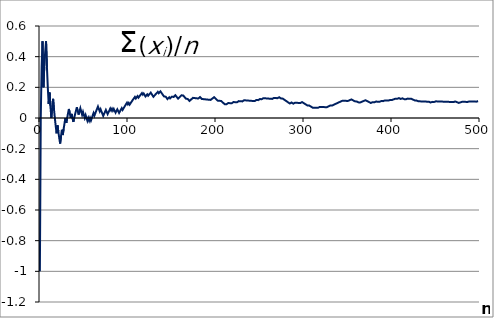
| Category | "Szum(xi)/n" |
|---|---|
| 1.0 | -1 |
| 2.0 | 0 |
| 3.0 | 0.333 |
| 4.0 | 0.5 |
| 5.0 | 0.2 |
| 6.0 | 0.333 |
| 7.0 | 0.429 |
| 8.0 | 0.5 |
| 9.0 | 0.333 |
| 10.0 | 0.2 |
| 11.0 | 0.091 |
| 12.0 | 0.167 |
| 13.0 | 0.077 |
| 14.0 | 0 |
| 15.0 | 0.067 |
| 16.0 | 0.125 |
| 17.0 | 0.059 |
| 18.0 | 0 |
| 19.0 | -0.053 |
| 20.0 | -0.1 |
| 21.0 | -0.048 |
| 22.0 | -0.091 |
| 23.0 | -0.13 |
| 24.0 | -0.167 |
| 25.0 | -0.12 |
| 26.0 | -0.077 |
| 27.0 | -0.111 |
| 28.0 | -0.071 |
| 29.0 | -0.034 |
| 30.0 | 0 |
| 31.0 | -0.032 |
| 32.0 | 0 |
| 33.0 | 0.03 |
| 34.0 | 0.059 |
| 35.0 | 0.029 |
| 36.0 | 0 |
| 37.0 | 0.027 |
| 38.0 | 0 |
| 39.0 | -0.026 |
| 40.0 | 0 |
| 41.0 | 0.024 |
| 42.0 | 0.048 |
| 43.0 | 0.07 |
| 44.0 | 0.045 |
| 45.0 | 0.022 |
| 46.0 | 0.043 |
| 47.0 | 0.064 |
| 48.0 | 0.042 |
| 49.0 | 0.02 |
| 50.0 | 0.04 |
| 51.0 | 0.02 |
| 52.0 | 0 |
| 53.0 | 0.019 |
| 54.0 | 0 |
| 55.0 | -0.018 |
| 56.0 | 0 |
| 57.0 | -0.018 |
| 58.0 | 0 |
| 59.0 | -0.017 |
| 60.0 | 0 |
| 61.0 | 0.016 |
| 62.0 | 0.032 |
| 63.0 | 0.016 |
| 64.0 | 0.031 |
| 65.0 | 0.046 |
| 66.0 | 0.061 |
| 67.0 | 0.075 |
| 68.0 | 0.059 |
| 69.0 | 0.043 |
| 70.0 | 0.057 |
| 71.0 | 0.042 |
| 72.0 | 0.028 |
| 73.0 | 0.014 |
| 74.0 | 0.027 |
| 75.0 | 0.04 |
| 76.0 | 0.053 |
| 77.0 | 0.039 |
| 78.0 | 0.026 |
| 79.0 | 0.038 |
| 80.0 | 0.05 |
| 81.0 | 0.062 |
| 82.0 | 0.049 |
| 83.0 | 0.06 |
| 84.0 | 0.048 |
| 85.0 | 0.059 |
| 86.0 | 0.047 |
| 87.0 | 0.034 |
| 88.0 | 0.045 |
| 89.0 | 0.056 |
| 90.0 | 0.044 |
| 91.0 | 0.033 |
| 92.0 | 0.043 |
| 93.0 | 0.054 |
| 94.0 | 0.064 |
| 95.0 | 0.053 |
| 96.0 | 0.062 |
| 97.0 | 0.072 |
| 98.0 | 0.082 |
| 99.0 | 0.091 |
| 100.0 | 0.1 |
| 101.0 | 0.089 |
| 102.0 | 0.098 |
| 103.0 | 0.087 |
| 104.0 | 0.096 |
| 105.0 | 0.105 |
| 106.0 | 0.113 |
| 107.0 | 0.121 |
| 108.0 | 0.13 |
| 109.0 | 0.138 |
| 110.0 | 0.127 |
| 111.0 | 0.135 |
| 112.0 | 0.143 |
| 113.0 | 0.133 |
| 114.0 | 0.14 |
| 115.0 | 0.148 |
| 116.0 | 0.155 |
| 117.0 | 0.162 |
| 118.0 | 0.153 |
| 119.0 | 0.16 |
| 120.0 | 0.15 |
| 121.0 | 0.14 |
| 122.0 | 0.148 |
| 123.0 | 0.154 |
| 124.0 | 0.145 |
| 125.0 | 0.152 |
| 126.0 | 0.159 |
| 127.0 | 0.165 |
| 128.0 | 0.156 |
| 129.0 | 0.147 |
| 130.0 | 0.138 |
| 131.0 | 0.145 |
| 132.0 | 0.152 |
| 133.0 | 0.158 |
| 134.0 | 0.164 |
| 135.0 | 0.17 |
| 136.0 | 0.162 |
| 137.0 | 0.168 |
| 138.0 | 0.174 |
| 139.0 | 0.165 |
| 140.0 | 0.157 |
| 141.0 | 0.149 |
| 142.0 | 0.141 |
| 143.0 | 0.147 |
| 144.0 | 0.139 |
| 145.0 | 0.131 |
| 146.0 | 0.123 |
| 147.0 | 0.129 |
| 148.0 | 0.135 |
| 149.0 | 0.128 |
| 150.0 | 0.133 |
| 151.0 | 0.139 |
| 152.0 | 0.145 |
| 153.0 | 0.137 |
| 154.0 | 0.143 |
| 155.0 | 0.148 |
| 156.0 | 0.141 |
| 157.0 | 0.134 |
| 158.0 | 0.127 |
| 159.0 | 0.132 |
| 160.0 | 0.138 |
| 161.0 | 0.143 |
| 162.0 | 0.148 |
| 163.0 | 0.153 |
| 164.0 | 0.146 |
| 165.0 | 0.139 |
| 166.0 | 0.133 |
| 167.0 | 0.126 |
| 168.0 | 0.131 |
| 169.0 | 0.124 |
| 170.0 | 0.118 |
| 171.0 | 0.111 |
| 172.0 | 0.116 |
| 173.0 | 0.121 |
| 174.0 | 0.126 |
| 175.0 | 0.131 |
| 176.0 | 0.136 |
| 177.0 | 0.13 |
| 178.0 | 0.124 |
| 179.0 | 0.128 |
| 180.0 | 0.122 |
| 181.0 | 0.127 |
| 182.0 | 0.132 |
| 183.0 | 0.137 |
| 184.0 | 0.13 |
| 185.0 | 0.124 |
| 186.0 | 0.129 |
| 187.0 | 0.123 |
| 188.0 | 0.128 |
| 189.0 | 0.122 |
| 190.0 | 0.116 |
| 191.0 | 0.12 |
| 192.0 | 0.125 |
| 193.0 | 0.119 |
| 194.0 | 0.124 |
| 195.0 | 0.118 |
| 196.0 | 0.122 |
| 197.0 | 0.127 |
| 198.0 | 0.131 |
| 199.0 | 0.136 |
| 200.0 | 0.13 |
| 201.0 | 0.124 |
| 202.0 | 0.119 |
| 203.0 | 0.113 |
| 204.0 | 0.108 |
| 205.0 | 0.112 |
| 206.0 | 0.107 |
| 207.0 | 0.111 |
| 208.0 | 0.106 |
| 209.0 | 0.1 |
| 210.0 | 0.095 |
| 211.0 | 0.09 |
| 212.0 | 0.085 |
| 213.0 | 0.089 |
| 214.0 | 0.093 |
| 215.0 | 0.098 |
| 216.0 | 0.093 |
| 217.0 | 0.097 |
| 218.0 | 0.101 |
| 219.0 | 0.096 |
| 220.0 | 0.1 |
| 221.0 | 0.104 |
| 222.0 | 0.099 |
| 223.0 | 0.103 |
| 224.0 | 0.107 |
| 225.0 | 0.102 |
| 226.0 | 0.106 |
| 227.0 | 0.11 |
| 228.0 | 0.114 |
| 229.0 | 0.109 |
| 230.0 | 0.104 |
| 231.0 | 0.108 |
| 232.0 | 0.112 |
| 233.0 | 0.116 |
| 234.0 | 0.111 |
| 235.0 | 0.115 |
| 236.0 | 0.119 |
| 237.0 | 0.114 |
| 238.0 | 0.109 |
| 239.0 | 0.113 |
| 240.0 | 0.108 |
| 241.0 | 0.112 |
| 242.0 | 0.107 |
| 243.0 | 0.111 |
| 244.0 | 0.107 |
| 245.0 | 0.11 |
| 246.0 | 0.114 |
| 247.0 | 0.117 |
| 248.0 | 0.121 |
| 249.0 | 0.116 |
| 250.0 | 0.12 |
| 251.0 | 0.124 |
| 252.0 | 0.127 |
| 253.0 | 0.123 |
| 254.0 | 0.126 |
| 255.0 | 0.129 |
| 256.0 | 0.133 |
| 257.0 | 0.128 |
| 258.0 | 0.124 |
| 259.0 | 0.127 |
| 260.0 | 0.123 |
| 261.0 | 0.126 |
| 262.0 | 0.13 |
| 263.0 | 0.125 |
| 264.0 | 0.121 |
| 265.0 | 0.125 |
| 266.0 | 0.128 |
| 267.0 | 0.131 |
| 268.0 | 0.127 |
| 269.0 | 0.13 |
| 270.0 | 0.126 |
| 271.0 | 0.129 |
| 272.0 | 0.132 |
| 273.0 | 0.136 |
| 274.0 | 0.131 |
| 275.0 | 0.127 |
| 276.0 | 0.123 |
| 277.0 | 0.126 |
| 278.0 | 0.122 |
| 279.0 | 0.118 |
| 280.0 | 0.114 |
| 281.0 | 0.11 |
| 282.0 | 0.106 |
| 283.0 | 0.102 |
| 284.0 | 0.099 |
| 285.0 | 0.095 |
| 286.0 | 0.098 |
| 287.0 | 0.101 |
| 288.0 | 0.097 |
| 289.0 | 0.093 |
| 290.0 | 0.097 |
| 291.0 | 0.1 |
| 292.0 | 0.096 |
| 293.0 | 0.099 |
| 294.0 | 0.102 |
| 295.0 | 0.098 |
| 296.0 | 0.095 |
| 297.0 | 0.098 |
| 298.0 | 0.101 |
| 299.0 | 0.104 |
| 300.0 | 0.1 |
| 301.0 | 0.096 |
| 302.0 | 0.093 |
| 303.0 | 0.089 |
| 304.0 | 0.086 |
| 305.0 | 0.082 |
| 306.0 | 0.085 |
| 307.0 | 0.081 |
| 308.0 | 0.078 |
| 309.0 | 0.074 |
| 310.0 | 0.071 |
| 311.0 | 0.068 |
| 312.0 | 0.071 |
| 313.0 | 0.067 |
| 314.0 | 0.064 |
| 315.0 | 0.067 |
| 316.0 | 0.063 |
| 317.0 | 0.066 |
| 318.0 | 0.069 |
| 319.0 | 0.072 |
| 320.0 | 0.075 |
| 321.0 | 0.072 |
| 322.0 | 0.068 |
| 323.0 | 0.071 |
| 324.0 | 0.074 |
| 325.0 | 0.071 |
| 326.0 | 0.067 |
| 327.0 | 0.07 |
| 328.0 | 0.073 |
| 329.0 | 0.076 |
| 330.0 | 0.079 |
| 331.0 | 0.082 |
| 332.0 | 0.078 |
| 333.0 | 0.081 |
| 334.0 | 0.084 |
| 335.0 | 0.087 |
| 336.0 | 0.089 |
| 337.0 | 0.092 |
| 338.0 | 0.095 |
| 339.0 | 0.097 |
| 340.0 | 0.1 |
| 341.0 | 0.103 |
| 342.0 | 0.105 |
| 343.0 | 0.108 |
| 344.0 | 0.11 |
| 345.0 | 0.113 |
| 346.0 | 0.116 |
| 347.0 | 0.112 |
| 348.0 | 0.115 |
| 349.0 | 0.112 |
| 350.0 | 0.114 |
| 351.0 | 0.111 |
| 352.0 | 0.114 |
| 353.0 | 0.116 |
| 354.0 | 0.119 |
| 355.0 | 0.121 |
| 356.0 | 0.118 |
| 357.0 | 0.115 |
| 358.0 | 0.112 |
| 359.0 | 0.109 |
| 360.0 | 0.106 |
| 361.0 | 0.108 |
| 362.0 | 0.105 |
| 363.0 | 0.102 |
| 364.0 | 0.104 |
| 365.0 | 0.101 |
| 366.0 | 0.104 |
| 367.0 | 0.106 |
| 368.0 | 0.109 |
| 369.0 | 0.111 |
| 370.0 | 0.114 |
| 371.0 | 0.116 |
| 372.0 | 0.113 |
| 373.0 | 0.11 |
| 374.0 | 0.107 |
| 375.0 | 0.104 |
| 376.0 | 0.101 |
| 377.0 | 0.098 |
| 378.0 | 0.101 |
| 379.0 | 0.103 |
| 380.0 | 0.1 |
| 381.0 | 0.102 |
| 382.0 | 0.105 |
| 383.0 | 0.107 |
| 384.0 | 0.104 |
| 385.0 | 0.106 |
| 386.0 | 0.104 |
| 387.0 | 0.106 |
| 388.0 | 0.108 |
| 389.0 | 0.111 |
| 390.0 | 0.108 |
| 391.0 | 0.11 |
| 392.0 | 0.112 |
| 393.0 | 0.115 |
| 394.0 | 0.117 |
| 395.0 | 0.114 |
| 396.0 | 0.116 |
| 397.0 | 0.113 |
| 398.0 | 0.116 |
| 399.0 | 0.118 |
| 400.0 | 0.12 |
| 401.0 | 0.117 |
| 402.0 | 0.119 |
| 403.0 | 0.122 |
| 404.0 | 0.124 |
| 405.0 | 0.126 |
| 406.0 | 0.128 |
| 407.0 | 0.125 |
| 408.0 | 0.127 |
| 409.0 | 0.13 |
| 410.0 | 0.127 |
| 411.0 | 0.124 |
| 412.0 | 0.126 |
| 413.0 | 0.128 |
| 414.0 | 0.126 |
| 415.0 | 0.123 |
| 416.0 | 0.12 |
| 417.0 | 0.122 |
| 418.0 | 0.124 |
| 419.0 | 0.126 |
| 420.0 | 0.124 |
| 421.0 | 0.126 |
| 422.0 | 0.128 |
| 423.0 | 0.125 |
| 424.0 | 0.123 |
| 425.0 | 0.12 |
| 426.0 | 0.117 |
| 427.0 | 0.115 |
| 428.0 | 0.112 |
| 429.0 | 0.114 |
| 430.0 | 0.112 |
| 431.0 | 0.109 |
| 432.0 | 0.111 |
| 433.0 | 0.109 |
| 434.0 | 0.111 |
| 435.0 | 0.108 |
| 436.0 | 0.106 |
| 437.0 | 0.108 |
| 438.0 | 0.105 |
| 439.0 | 0.107 |
| 440.0 | 0.105 |
| 441.0 | 0.107 |
| 442.0 | 0.104 |
| 443.0 | 0.106 |
| 444.0 | 0.104 |
| 445.0 | 0.101 |
| 446.0 | 0.103 |
| 447.0 | 0.105 |
| 448.0 | 0.107 |
| 449.0 | 0.105 |
| 450.0 | 0.107 |
| 451.0 | 0.109 |
| 452.0 | 0.111 |
| 453.0 | 0.108 |
| 454.0 | 0.106 |
| 455.0 | 0.108 |
| 456.0 | 0.105 |
| 457.0 | 0.107 |
| 458.0 | 0.109 |
| 459.0 | 0.107 |
| 460.0 | 0.104 |
| 461.0 | 0.106 |
| 462.0 | 0.108 |
| 463.0 | 0.106 |
| 464.0 | 0.103 |
| 465.0 | 0.105 |
| 466.0 | 0.107 |
| 467.0 | 0.105 |
| 468.0 | 0.103 |
| 469.0 | 0.104 |
| 470.0 | 0.102 |
| 471.0 | 0.104 |
| 472.0 | 0.106 |
| 473.0 | 0.108 |
| 474.0 | 0.105 |
| 475.0 | 0.103 |
| 476.0 | 0.101 |
| 477.0 | 0.099 |
| 478.0 | 0.1 |
| 479.0 | 0.102 |
| 480.0 | 0.104 |
| 481.0 | 0.106 |
| 482.0 | 0.108 |
| 483.0 | 0.106 |
| 484.0 | 0.107 |
| 485.0 | 0.105 |
| 486.0 | 0.103 |
| 487.0 | 0.105 |
| 488.0 | 0.107 |
| 489.0 | 0.108 |
| 490.0 | 0.11 |
| 491.0 | 0.108 |
| 492.0 | 0.11 |
| 493.0 | 0.108 |
| 494.0 | 0.105 |
| 495.0 | 0.107 |
| 496.0 | 0.105 |
| 497.0 | 0.107 |
| 498.0 | 0.108 |
| 499.0 | 0.11 |
| 500.0 | 0.108 |